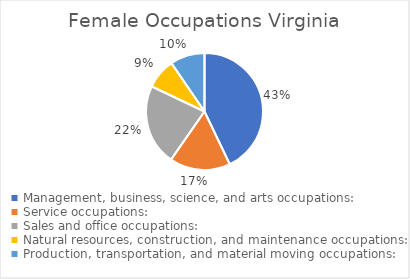
| Category | Series 0 | Series 1 | Series 2 |
|---|---|---|---|
| Management, business, science, and arts occupations: | 1731299 | 839679 | 891620 |
| Service occupations: | 677558 | 289092 | 388466 |
| Sales and office occupations: | 902731 | 334756 | 567975 |
| Natural resources, construction, and maintenance occupations: | 339501 | 324805 | 14696 |
| Production, transportation, and material moving occupations: | 385367 | 296962 | 88405 |